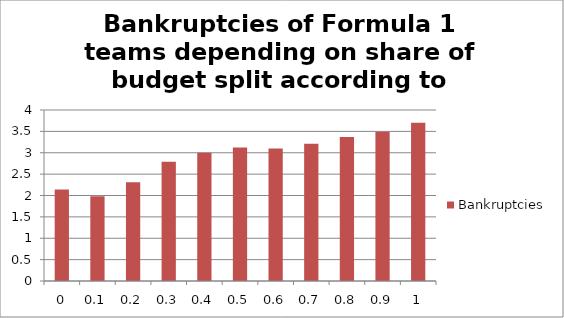
| Category | Bankruptcies |
|---|---|
| 0.0 | 2.14 |
| 0.1 | 1.98 |
| 0.2 | 2.31 |
| 0.3 | 2.79 |
| 0.4 | 3 |
| 0.5 | 3.12 |
| 0.6 | 3.1 |
| 0.7 | 3.21 |
| 0.8 | 3.37 |
| 0.9 | 3.49 |
| 1.0 | 3.7 |